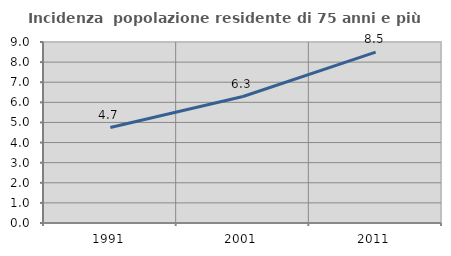
| Category | Incidenza  popolazione residente di 75 anni e più |
|---|---|
| 1991.0 | 4.748 |
| 2001.0 | 6.29 |
| 2011.0 | 8.494 |